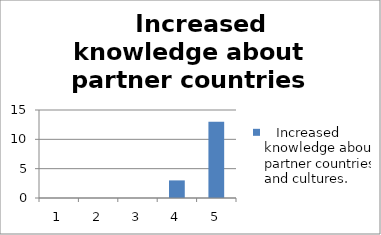
| Category |    Increased knowledge about partner countries and cultures. |
|---|---|
| 0 | 0 |
| 1 | 0 |
| 2 | 0 |
| 3 | 3 |
| 4 | 13 |